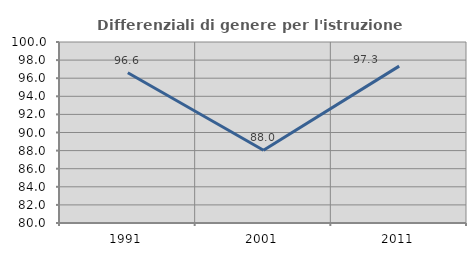
| Category | Differenziali di genere per l'istruzione superiore |
|---|---|
| 1991.0 | 96.602 |
| 2001.0 | 88.036 |
| 2011.0 | 97.336 |